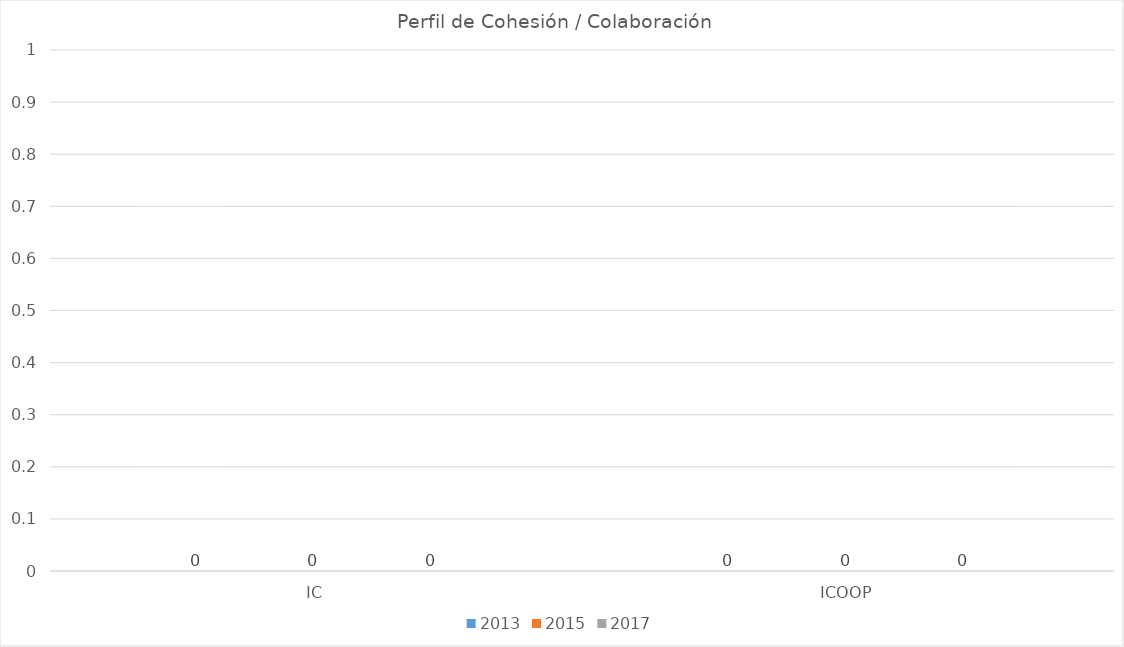
| Category | 2013 | 2015 | 2017 |
|---|---|---|---|
| IC | 0 | 0 | 0 |
| ICOOP | 0 | 0 | 0 |